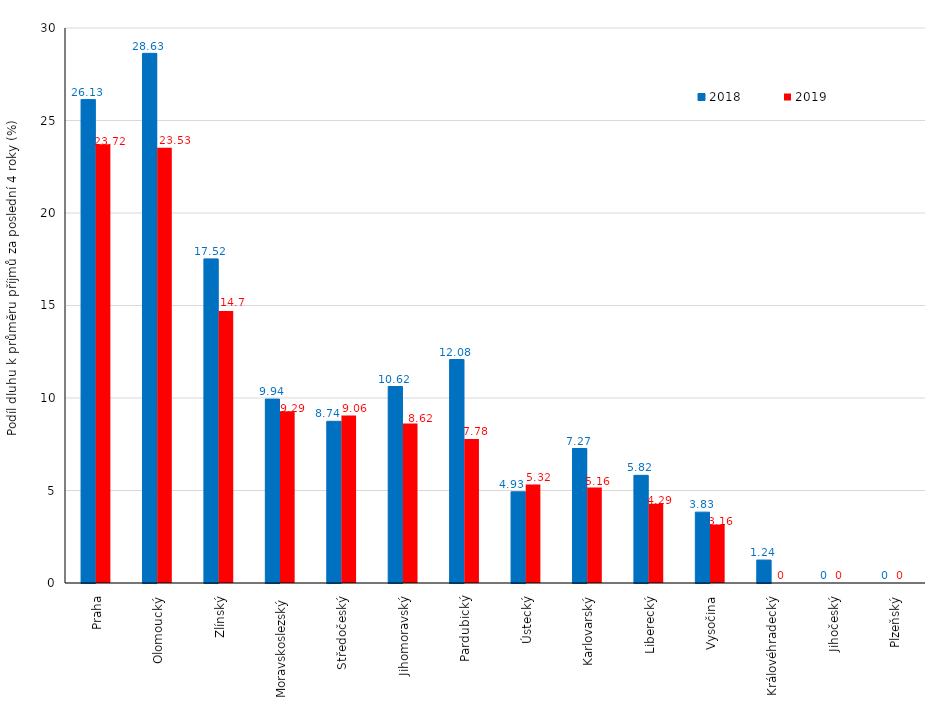
| Category | 2018 | 2019 |
|---|---|---|
| Praha | 26.13 | 23.72 |
| Olomoucký | 28.63 | 23.53 |
| Zlínský | 17.52 | 14.7 |
| Moravskoslezský | 9.94 | 9.29 |
| Středočeský | 8.74 | 9.06 |
| Jihomoravský | 10.62 | 8.62 |
| Pardubický | 12.08 | 7.78 |
| Ústecký | 4.93 | 5.32 |
| Karlovarský | 7.27 | 5.16 |
| Liberecký | 5.82 | 4.29 |
| Vysočina | 3.83 | 3.16 |
| Královéhradecký | 1.24 | 0 |
| Jihočeský | 0 | 0 |
| Plzeňský | 0 | 0 |